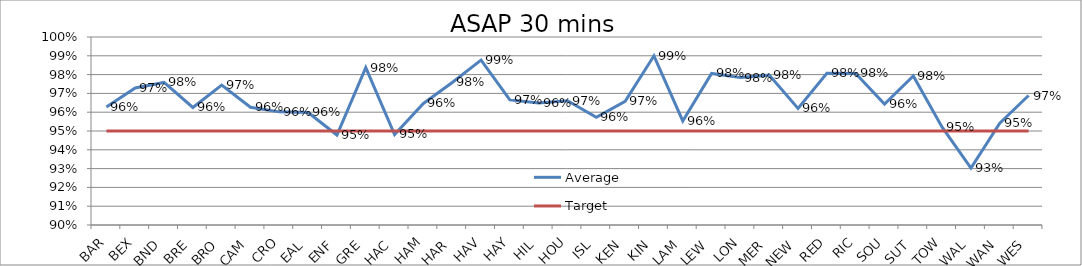
| Category | Average | Target |
|---|---|---|
| BAR | 0.963 | 0.95 |
| BEX | 0.973 | 0.95 |
| BND | 0.976 | 0.95 |
| BRE | 0.963 | 0.95 |
| BRO | 0.974 | 0.95 |
| CAM | 0.963 | 0.95 |
| CRO | 0.96 | 0.95 |
| EAL | 0.96 | 0.95 |
| ENF | 0.948 | 0.95 |
| GRE | 0.984 | 0.95 |
| HAC | 0.948 | 0.95 |
| HAM | 0.965 | 0.95 |
| HAR | 0.976 | 0.95 |
| HAV | 0.988 | 0.95 |
| HAY | 0.967 | 0.95 |
| HIL | 0.965 | 0.95 |
| HOU | 0.966 | 0.95 |
| ISL | 0.957 | 0.95 |
| KEN | 0.966 | 0.95 |
| KIN | 0.99 | 0.95 |
| LAM | 0.955 | 0.95 |
| LEW | 0.981 | 0.95 |
| LON | 0.978 | 0.95 |
| MER | 0.98 | 0.95 |
| NEW | 0.962 | 0.95 |
| RED | 0.981 | 0.95 |
| RIC | 0.981 | 0.95 |
| SOU | 0.964 | 0.95 |
| SUT | 0.979 | 0.95 |
| TOW | 0.952 | 0.95 |
| WAL | 0.93 | 0.95 |
| WAN | 0.954 | 0.95 |
| WES | 0.969 | 0.95 |